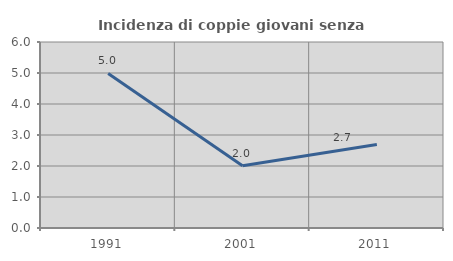
| Category | Incidenza di coppie giovani senza figli |
|---|---|
| 1991.0 | 4.986 |
| 2001.0 | 2.01 |
| 2011.0 | 2.696 |